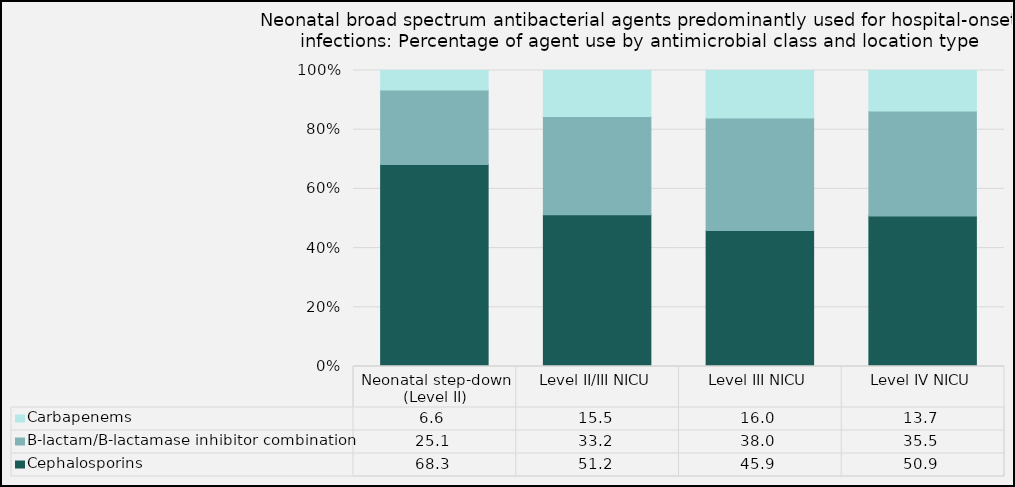
| Category | Cephalosporins | Β-lactam/Β-lactamase inhibitor combination | Carbapenems |
|---|---|---|---|
| Neonatal step-down (Level II) | 68.26 | 25.14 | 6.6 |
| Level II/III NICU | 51.23 | 33.23 | 15.54 |
| Level III NICU | 45.93 | 38.03 | 16.04 |
| Level IV NICU | 50.86 | 35.49 | 13.65 |